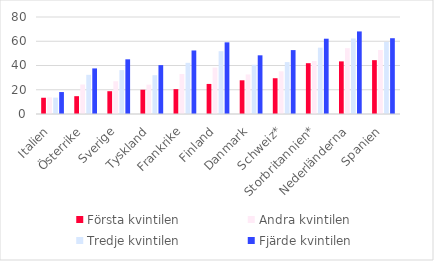
| Category | Första kvintilen | Andra kvintilen | Tredje kvintilen | Fjärde kvintilen |
|---|---|---|---|---|
| Italien | 13.4 | 13.7 | 13.5 | 18.1 |
| Österrike | 14.7 | 24.3 | 32.3 | 37.6 |
| Sverige | 18.8 | 27 | 36.2 | 45.1 |
| Tyskland | 20 | 24.2 | 32 | 40.3 |
| Frankrike | 20.5 | 33 | 42.2 | 52.4 |
| Finland | 24.8 | 38.3 | 51.8 | 59.1 |
| Danmark | 27.8 | 32.6 | 40.6 | 48.4 |
| Schweiz* | 29.5 | 35.2 | 42.8 | 52.7 |
| Storbritannien* | 41.9 | 43.7 | 54.7 | 62.1 |
| Nederländerna | 43.4 | 54.3 | 62.3 | 68.1 |
| Spanien | 44.4 | 52.8 | 59.5 | 62.5 |